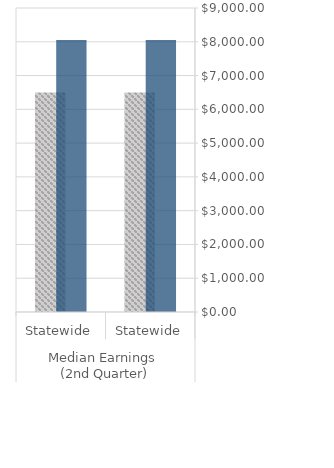
| Category | Negotiated | Actual |
|---|---|---|
| 0 | 6500 | 8052.05 |
| 1 | 6500 | 8052.05 |